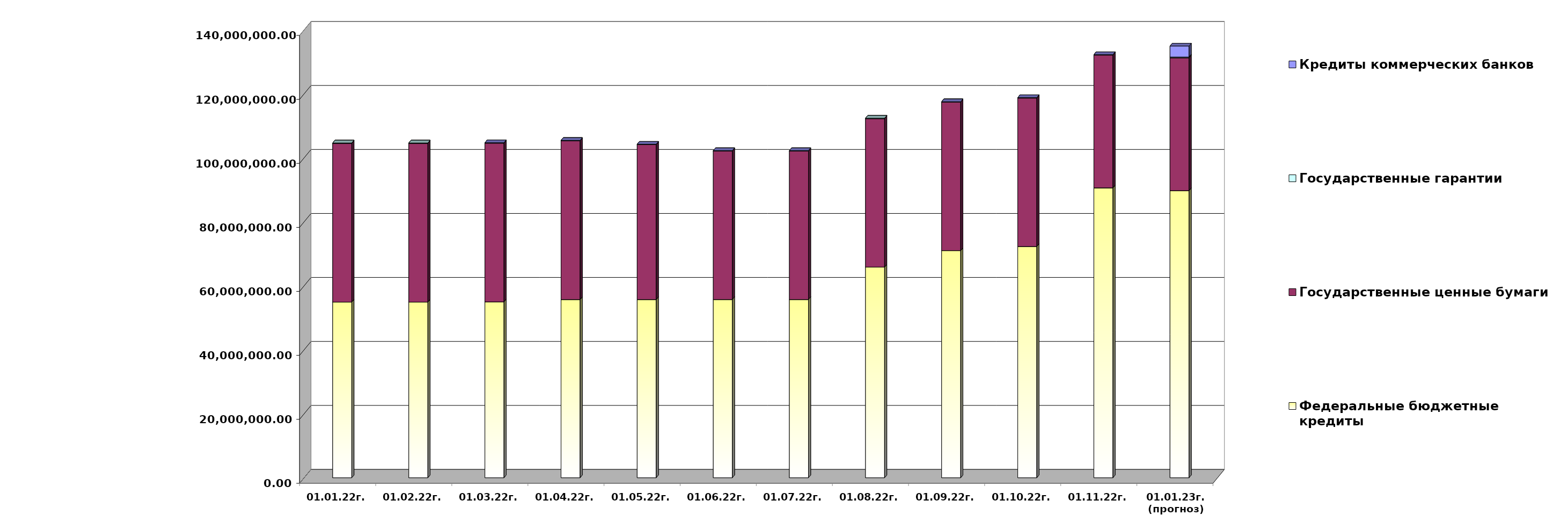
| Category | Федеральные бюджетные кредиты | Государственные ценные бумаги  | Государственные гарантии | Кредиты коммерческих банков |
|---|---|---|---|---|
| 01.01.22г. | 54900618.713 | 49600000 | 141570.67 | 0 |
| 01.02.22г. | 54900618.713 | 49600000 | 139748.87 | 0 |
| 01.03.22г. | 54970753.113 | 49600000 | 139748.87 | 0 |
| 01.04.22г. | 55700753.113 | 49600000 | 139748.87 | 0 |
| 01.05.22г. | 55700753.113 | 48400000 | 138270.964 | 0 |
| 01.06.22г. | 55705077.413 | 46400000 | 138270.964 | 0 |
| 01.07.22г. | 55705077.413 | 46400000 | 138270.964 | 0 |
| 01.08.22г. | 65845099.48 | 46400000 | 134576.199 | 0 |
| 01.09.22г. | 71000838.41 | 46400000 | 134576.199 | 0 |
| 01.10.22г. | 72274148.94 | 46400000 | 134576.199 | 0 |
| 01.11.22г. | 90603290.06 | 41500000 | 129957.74 | 0 |
| 01.01.23г.
(прогноз) | 89741231.3 | 41500000 | 265278.1 | 3429758.8 |